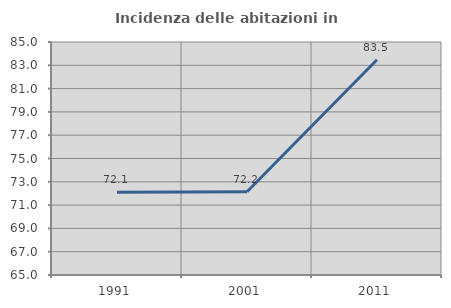
| Category | Incidenza delle abitazioni in proprietà  |
|---|---|
| 1991.0 | 72.093 |
| 2001.0 | 72.152 |
| 2011.0 | 83.482 |